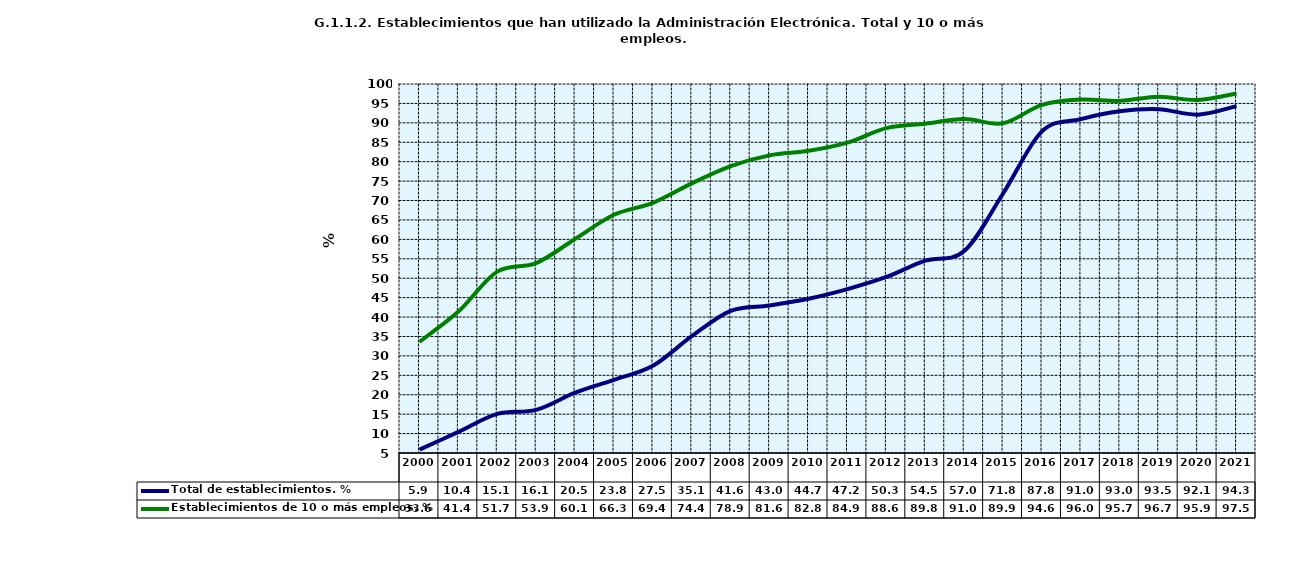
| Category | Total de establecimientos. % | Establecimientos de 10 o más empleos. % |
|---|---|---|
| 2000.0 | 5.883 | 33.627 |
| 2001.0 | 10.421 | 41.411 |
| 2002.0 | 15.068 | 51.694 |
| 2003.0 | 16.098 | 53.904 |
| 2004.0 | 20.515 | 60.107 |
| 2005.0 | 23.837 | 66.349 |
| 2006.0 | 27.46 | 69.402 |
| 2007.0 | 35.078 | 74.42 |
| 2008.0 | 41.612 | 78.862 |
| 2009.0 | 42.972 | 81.627 |
| 2010.0 | 44.715 | 82.794 |
| 2011.0 | 47.2 | 84.9 |
| 2012.0 | 50.321 | 88.639 |
| 2013.0 | 54.524 | 89.774 |
| 2014.0 | 56.986 | 90.972 |
| 2015.0 | 71.8 | 89.9 |
| 2016.0 | 87.813 | 94.63 |
| 2017.0 | 90.959 | 95.981 |
| 2018.0 | 92.961 | 95.655 |
| 2019.0 | 93.517 | 96.71 |
| 2020.0 | 92.114 | 95.9 |
| 2021.0 | 94.294 | 97.529 |